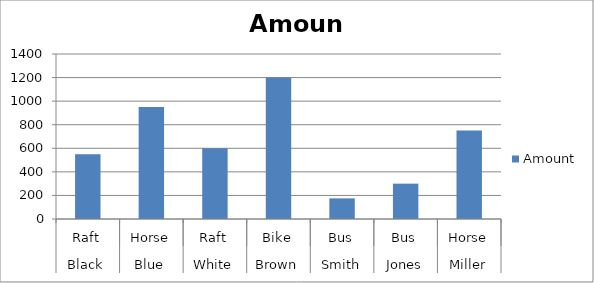
| Category | Amount |
|---|---|
| 0 | 550 |
| 1 | 950 |
| 2 | 600 |
| 3 | 1200 |
| 4 | 175 |
| 5 | 300 |
| 6 | 750 |